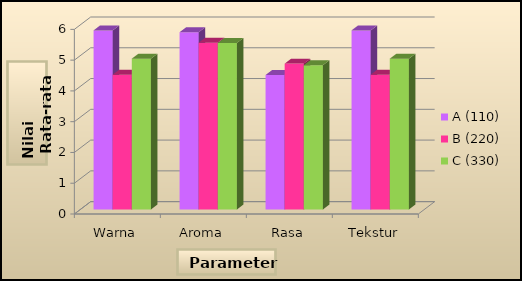
| Category | A (110) | B (220) | C (330) |
|---|---|---|---|
| Warna | 5.82 | 4.38 | 4.9 |
| Aroma | 5.76 | 5.42 | 5.41 |
| Rasa | 4.37 | 4.74 | 4.69 |
| Tekstur | 5.82 | 4.38 | 4.9 |